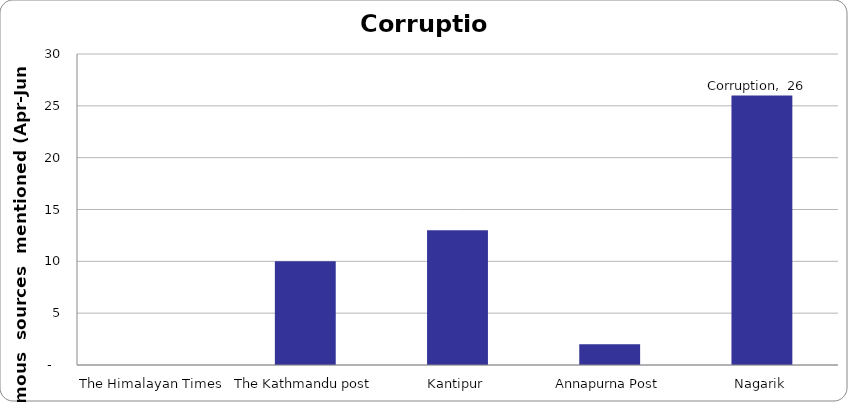
| Category | Corruption |
|---|---|
| The Himalayan Times | 0 |
| The Kathmandu post | 10 |
| Kantipur | 13 |
| Annapurna Post | 2 |
| Nagarik | 26 |